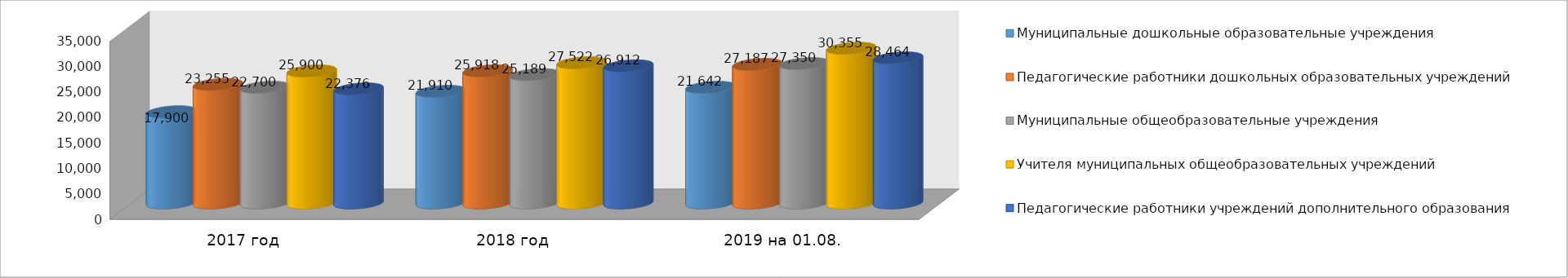
| Category | Муниципальные дошкольные образовательные учреждения | Педагогические работники дошкольных образовательных учреждений | Муниципальные общеобразовательные учреждения | Учителя муниципальных общеобразовательных учреждений | Педагогические работники учреждений дополнительного образования |
|---|---|---|---|---|---|
| 2017 год | 17900 | 23255 | 22700 | 25900 | 22376 |
| 2018 год | 21910 | 25918 | 25189 | 27522 | 26912 |
| 2019 на 01.08. | 22702 | 27187 | 27350 | 30355 | 28464 |